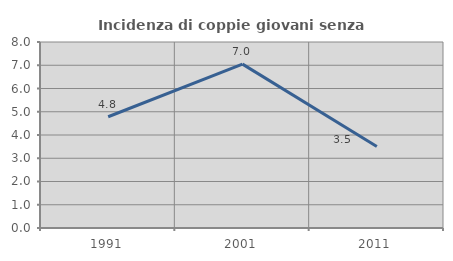
| Category | Incidenza di coppie giovani senza figli |
|---|---|
| 1991.0 | 4.785 |
| 2001.0 | 7.048 |
| 2011.0 | 3.509 |